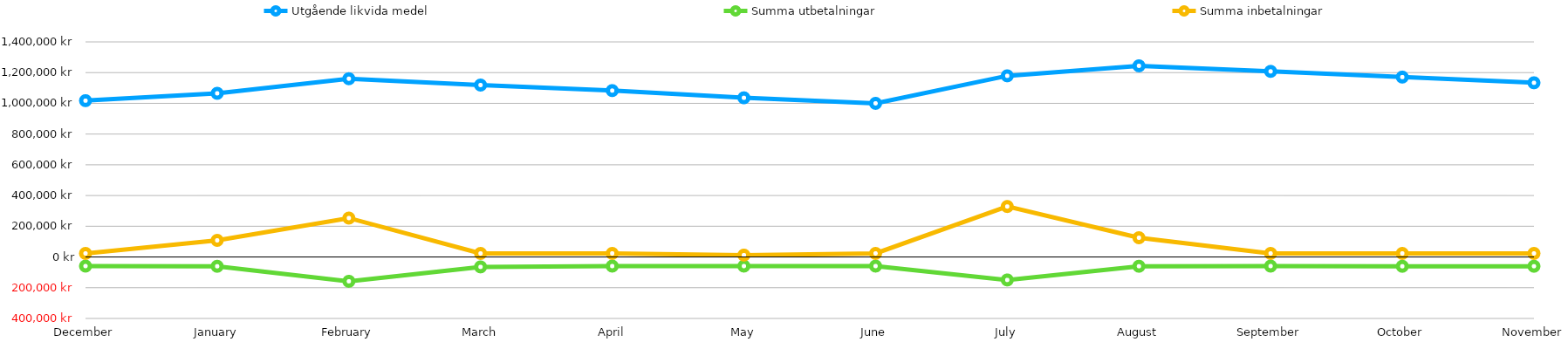
| Category | Utgående likvida medel | Summa utbetalningar | Summa inbetalningar |
|---|---|---|---|
| 2015-12-31 | 1017465 | -59227 | 23227 |
| 2016-01-31 | 1065215 | -60477 | 108227 |
| 2016-02-29 | 1160215 | -158227 | 253227 |
| 2016-03-31 | 1118965 | -64477 | 23227 |
| 2016-04-30 | 1082965 | -59227 | 23227 |
| 2016-05-31 | 1035965 | -59227 | 12227 |
| 2016-06-30 | 999965 | -59227 | 23227 |
| 2016-07-31 | 1179115 | -149477 | 328627 |
| 2016-08-31 | 1244115 | -60227 | 125227 |
| 2016-09-30 | 1208115 | -59227 | 23227 |
| 2016-10-31 | 1170865 | -60477 | 23227 |
| 2016-11-30 | 1133865 | -60227 | 23227 |